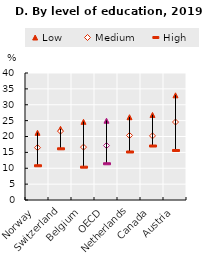
| Category | Low  | Medium | High |
|---|---|---|---|
| Norway | 21.173 | 16.485 | 10.783 |
| Switzerland | 22.423 | 21.699 | 16.122 |
| Belgium | 24.631 | 16.662 | 10.336 |
| OECD | 24.973 | 17.143 | 11.414 |
| Netherlands | 26.078 | 20.33 | 15.122 |
| Canada | 26.8 | 20.2 | 17 |
| Austria | 32.974 | 24.559 | 15.593 |